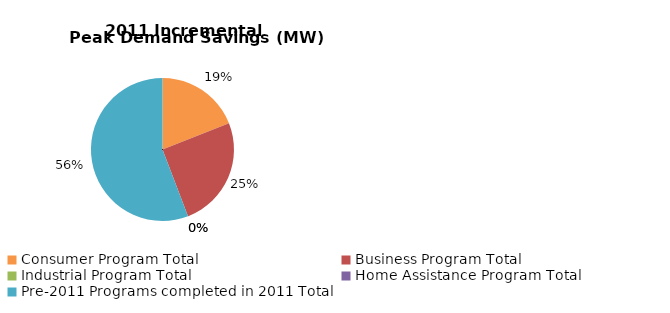
| Category | Incremental Peak Demand Savings (kW) |
|---|---|
| Consumer Program Total | 17.651 |
| Business Program Total | 23.427 |
| Industrial Program Total | 0 |
| Home Assistance Program Total | 0 |
| Pre-2011 Programs completed in 2011 Total | 51.866 |